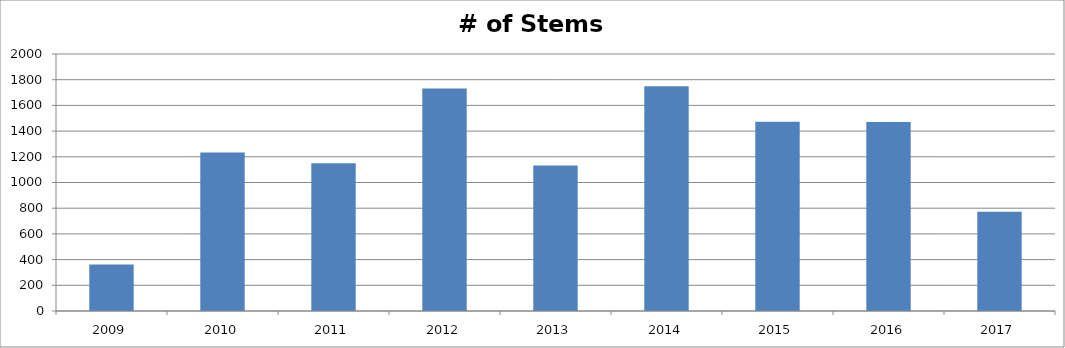
| Category | # of Stems Observed |
|---|---|
| 2009.0 | 361 |
| 2010.0 | 1234 |
| 2011.0 | 1149 |
| 2012.0 | 1732 |
| 2013.0 | 1132 |
| 2014.0 | 1750 |
| 2015.0 | 1473 |
| 2016.0 | 1470 |
| 2017.0 | 772 |